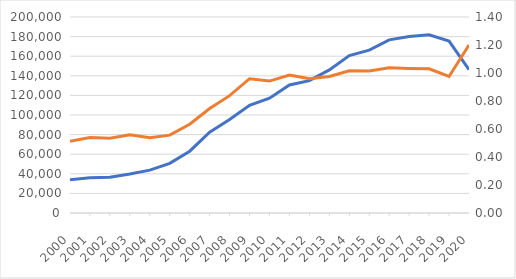
| Category | Aide à domicile |
|---|---|
| 2000-01-01 | 33904.599 |
| 2001-01-01 | 35922 |
| 2002-01-01 | 36578 |
| 2003-01-01 | 39782 |
| 2004-01-01 | 43751 |
| 2005-01-01 | 50668 |
| 2006-01-01 | 63076 |
| 2007-01-01 | 82476 |
| 2008-01-01 | 95387 |
| 2009-01-01 | 109832 |
| 2010-01-01 | 117127 |
| 2011-01-01 | 130604 |
| 2012-01-01 | 135045 |
| 2013-01-01 | 145978 |
| 2014-01-01 | 160689 |
| 2015-01-01 | 166192 |
| 2016-01-01 | 176677 |
| 2017-01-01 | 180175 |
| 2018-01-01 | 181815 |
| 2019-01-01 | 175478 |
| 2020-01-01 | 146282.782 |